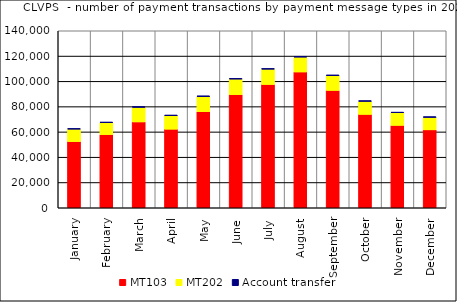
| Category | MT103 | MT202 | Account transfer |
|---|---|---|---|
| January | 52362 | 9829 | 530 |
| February | 57888 | 9384 | 562 |
| March | 67912 | 11497 | 641 |
| April | 62152 | 10663 | 541 |
| May | 76040 | 11916 | 580 |
| June | 89516 | 12277 | 550 |
| July | 97522 | 12100 | 569 |
| August | 107416 | 11755 | 580 |
| September | 92830 | 11656 | 590 |
| October | 73845 | 10336 | 568 |
| November | 65158 | 9991 | 530 |
| December | 61620 | 9871 | 592 |